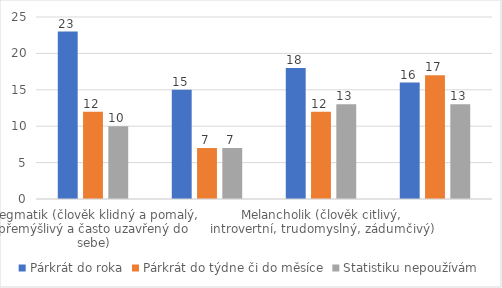
| Category | Párkrát do roka | Párkrát do týdne či do měsíce | Statistiku nepoužívám |
|---|---|---|---|
| Flegmatik (člověk klidný a pomalý, přemýšlivý a často uzavřený do sebe) | 23 | 12 | 10 |
| Cholerik (člověk vznětlivý a výbušný) | 15 | 7 | 7 |
| Melancholik (člověk citlivý, introvertní, trudomyslný, zádumčivý) | 18 | 12 | 13 |
| Sangvinik (člověk energický, optimistický, emočně stabilní) | 16 | 17 | 13 |